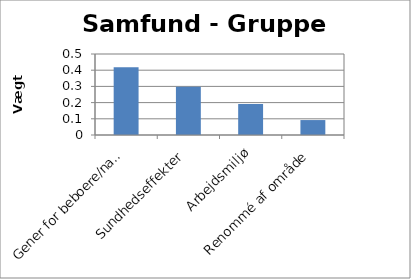
| Category | Vægt 1 |
|---|---|
| Gener for beboere/naboer | 0.418 |
| Sundhedseffekter | 0.299 |
| Arbejdsmiljø | 0.191 |
| Renommé af område | 0.092 |